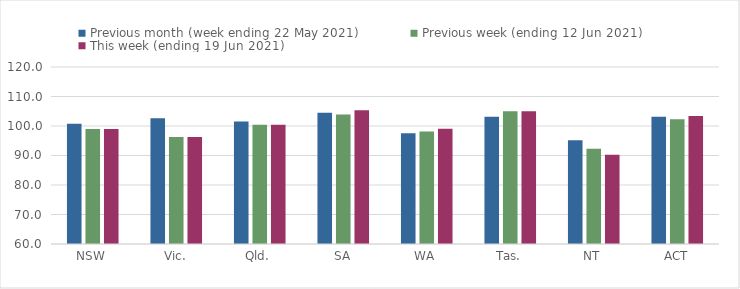
| Category | Previous month (week ending 22 May 2021) | Previous week (ending 12 Jun 2021) | This week (ending 19 Jun 2021) |
|---|---|---|---|
| NSW | 100.8 | 99 | 99 |
| Vic. | 102.59 | 96.29 | 96.29 |
| Qld. | 101.56 | 100.41 | 100.41 |
| SA | 104.46 | 103.87 | 105.34 |
| WA | 97.57 | 98.17 | 99.05 |
| Tas. | 103.1 | 104.98 | 104.98 |
| NT | 95.14 | 92.3 | 90.28 |
| ACT | 103.11 | 102.33 | 103.35 |